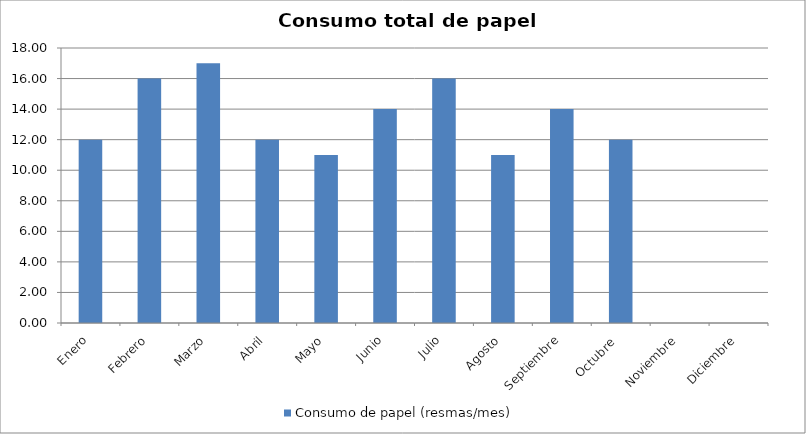
| Category | Consumo de papel (resmas/mes) |
|---|---|
| Enero | 12 |
| Febrero | 16 |
| Marzo | 17 |
| Abril | 12 |
| Mayo | 11 |
| Junio | 14 |
| Julio | 16 |
| Agosto | 11 |
| Septiembre | 14 |
| Octubre  | 12 |
| Noviembre | 0 |
| Diciembre | 0 |